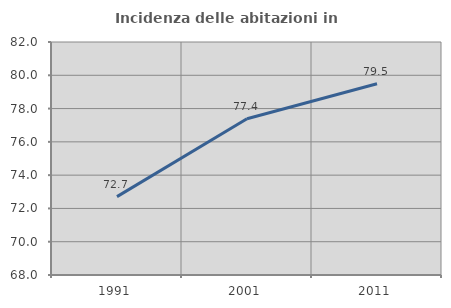
| Category | Incidenza delle abitazioni in proprietà  |
|---|---|
| 1991.0 | 72.708 |
| 2001.0 | 77.39 |
| 2011.0 | 79.495 |